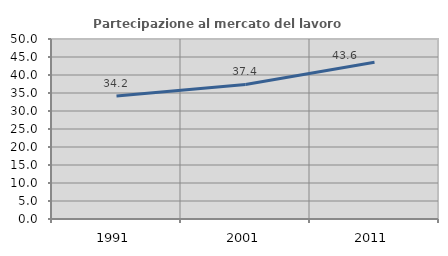
| Category | Partecipazione al mercato del lavoro  femminile |
|---|---|
| 1991.0 | 34.193 |
| 2001.0 | 37.364 |
| 2011.0 | 43.564 |